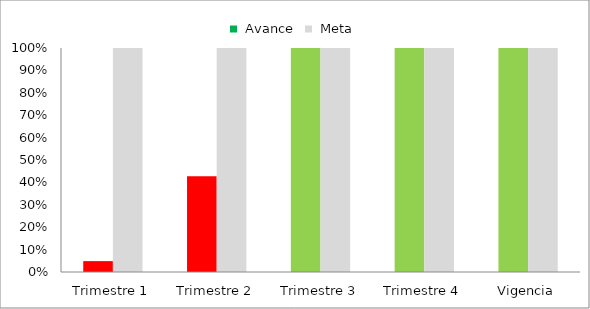
| Category | Series 0 | Series 1 |
|---|---|---|
| Trimestre 1 | 0.049 | 1 |
| Trimestre 2 | 0.427 | 1 |
| Trimestre 3 | 1 | 1 |
| Trimestre 4 | 1 | 1 |
| Vigencia | 1 | 1 |